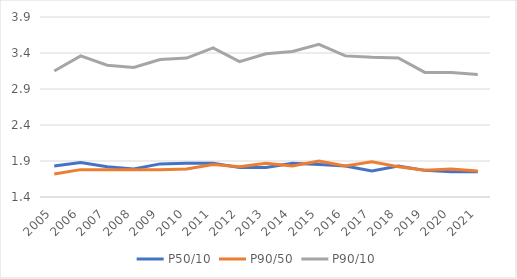
| Category | P50/10 | P90/50 | P90/10 |
|---|---|---|---|
| 2005.0 | 1.83 | 1.72 | 3.15 |
| 2006.0 | 1.88 | 1.78 | 3.36 |
| 2007.0 | 1.82 | 1.78 | 3.23 |
| 2008.0 | 1.79 | 1.78 | 3.2 |
| 2009.0 | 1.86 | 1.78 | 3.31 |
| 2010.0 | 1.87 | 1.79 | 3.33 |
| 2011.0 | 1.87 | 1.85 | 3.47 |
| 2012.0 | 1.81 | 1.82 | 3.28 |
| 2013.0 | 1.81 | 1.87 | 3.39 |
| 2014.0 | 1.87 | 1.83 | 3.42 |
| 2015.0 | 1.85 | 1.9 | 3.52 |
| 2016.0 | 1.83 | 1.83 | 3.36 |
| 2017.0 | 1.76 | 1.89 | 3.34 |
| 2018.0 | 1.83 | 1.82 | 3.33 |
| 2019.0 | 1.77 | 1.77 | 3.13 |
| 2020.0 | 1.75 | 1.79 | 3.13 |
| 2021.0 | 1.75 | 1.76 | 3.1 |